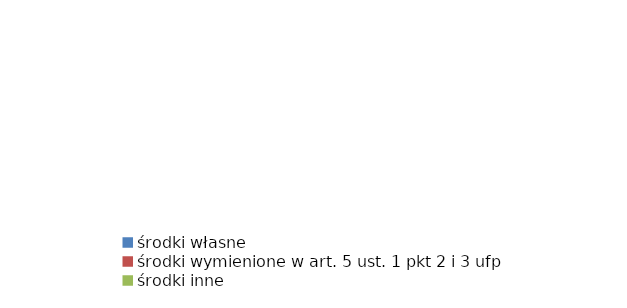
| Category | Series 0 |
|---|---|
| środki własne | 0 |
| środki wymienione w art. 5 ust. 1 pkt 2 i 3 ufp | 0 |
| środki inne | 0 |